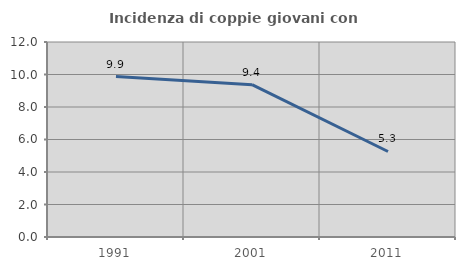
| Category | Incidenza di coppie giovani con figli |
|---|---|
| 1991.0 | 9.877 |
| 2001.0 | 9.375 |
| 2011.0 | 5.263 |